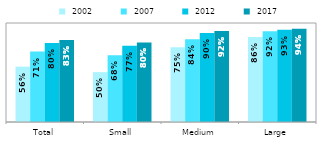
| Category |  2002 |  2007 |  2012 |  2017 |
|---|---|---|---|---|
| Total | 0.559 | 0.712 | 0.798 | 0.829 |
| Small | 0.503 | 0.675 | 0.771 | 0.804 |
| Medium | 0.754 | 0.837 | 0.899 | 0.918 |
| Large | 0.858 | 0.917 | 0.931 | 0.942 |